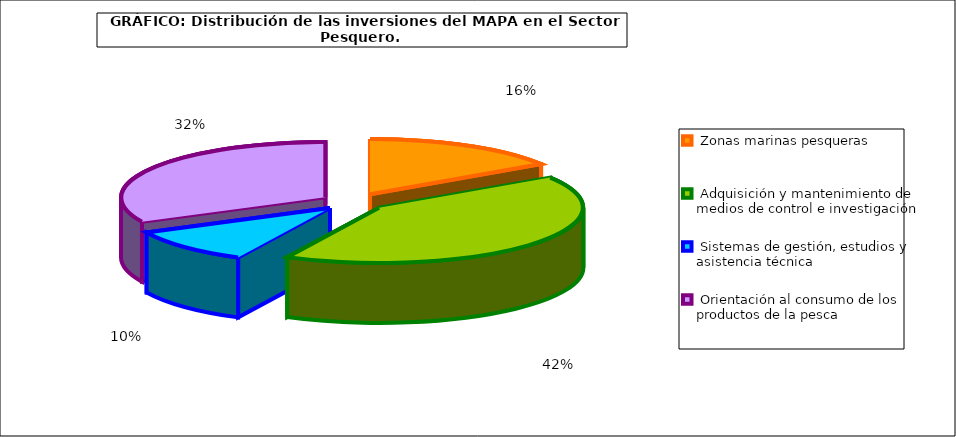
| Category | Series 0 |
|---|---|
|  Zonas marinas pesqueras | 4160.47 |
|  Adquisición y mantenimiento de medios de control e investigación  | 10961.05 |
|  Sistemas de gestión, estudios y asistencia técnica | 2714.11 |
|  Orientación al consumo de los productos de la pesca | 8498.55 |